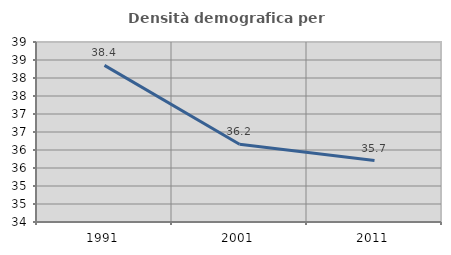
| Category | Densità demografica |
|---|---|
| 1991.0 | 38.351 |
| 2001.0 | 36.158 |
| 2011.0 | 35.706 |